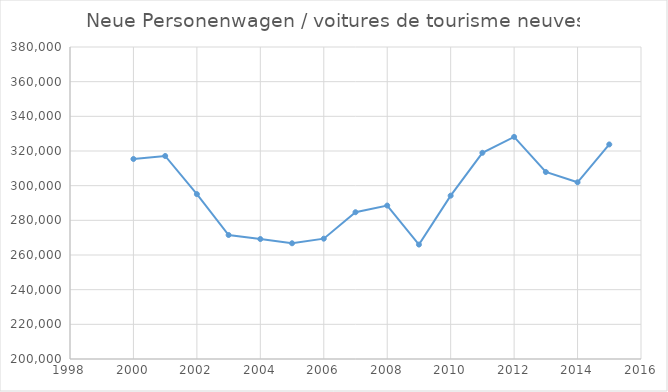
| Category | Neue Personenwagen / voitures de tourisme neuves |
|---|---|
| 2015.0 | 323783 |
| 2014.0 | 301942 |
| 2013.0 | 307885 |
| 2012.0 | 328139 |
| 2011.0 | 318958 |
| 2010.0 | 294239 |
| 2009.0 | 266018 |
| 2008.0 | 288525 |
| 2007.0 | 284674 |
| 2006.0 | 269421 |
| 2005.0 | 266770 |
| 2004.0 | 269211 |
| 2003.0 | 271541 |
| 2002.0 | 295109 |
| 2001.0 | 317126 |
| 2000.0 | 315398 |